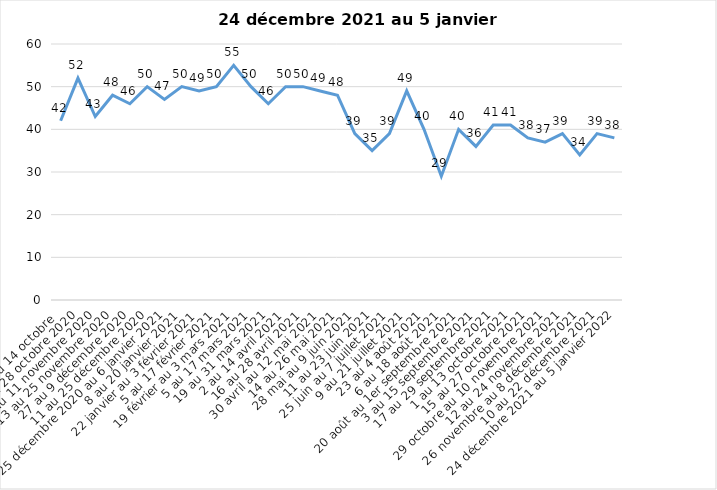
| Category | Toujours aux trois mesures |
|---|---|
| 2 au 14 octobre  | 42 |
| 16 au 28 octobre 2020 | 52 |
| 30 octobre au 11 novembre 2020 | 43 |
| 13 au 25 novembre 2020 | 48 |
| 27 au 9 décembre 2020 | 46 |
| 11 au 25 décembre 2020 | 50 |
| 25 décembre 2020 au 6 janvier 2021 | 47 |
| 8 au 20 janvier 2021 | 50 |
| 22 janvier au 3 février 2021 | 49 |
| 5 au 17 février 2021 | 50 |
| 19 février au 3 mars 2021 | 55 |
| 5 au 17 mars 2021 | 50 |
| 19 au 31 mars 2021 | 46 |
| 2 au 14 avril 2021 | 50 |
| 16 au 28 avril 2021 | 50 |
| 30 avril au 12 mai 2021 | 49 |
| 14 au 26 mai 2021 | 48 |
| 28 mai au 9 juin 2021 | 39 |
| 11 au 23 juin 2021 | 35 |
| 25 juin au 7 juillet 2021 | 39 |
| 9 au 21 juillet 2021 | 49 |
| 23 au 4 août 2021 | 40 |
| 6 au 18 août 2021 | 29 |
| 20 août au 1er septembre 2021 | 40 |
| 3 au 15 septembre 2021 | 36 |
| 17 au 29 septembre 2021 | 41 |
| 1 au 13 octobre 2021 | 41 |
| 15 au 27 octobre 2021 | 38 |
| 29 octobre au 10 novembre 2021 | 37 |
| 12 au 24 novembre 2021 | 39 |
| 26 novembre au 8 décembre 2021 | 34 |
| 10 au 22 décembre 2021 | 39 |
| 24 décembre 2021 au 5 janvier 2022 | 38 |